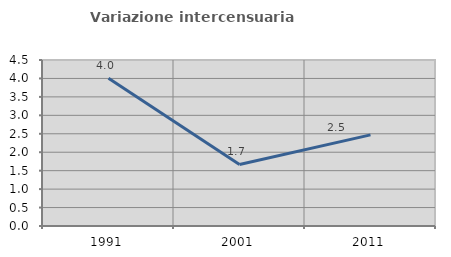
| Category | Variazione intercensuaria annua |
|---|---|
| 1991.0 | 4.006 |
| 2001.0 | 1.668 |
| 2011.0 | 2.471 |